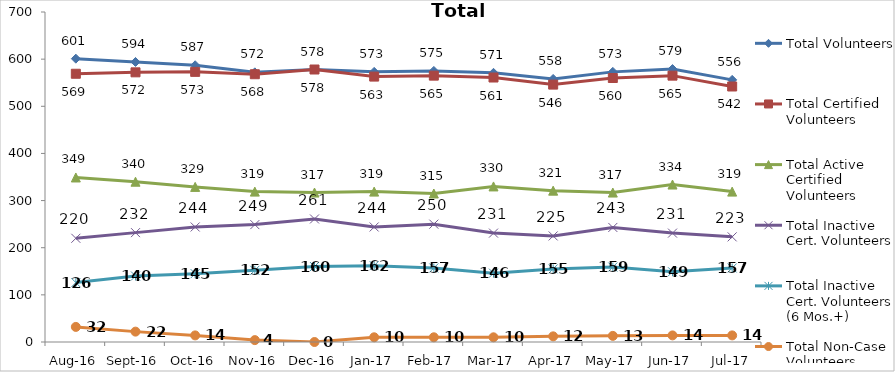
| Category | Total Volunteers | Total Certified Volunteers | Total Active Certified Volunteers | Total Inactive Cert. Volunteers | Total Inactive Cert. Volunteers (6 Mos.+) | Total Non-Case Volunteers |
|---|---|---|---|---|---|---|
| Aug-16 | 601 | 569 | 349 | 220 | 126 | 32 |
| Sep-16 | 594 | 572 | 340 | 232 | 140 | 22 |
| Oct-16 | 587 | 573 | 329 | 244 | 145 | 14 |
| Nov-16 | 572 | 568 | 319 | 249 | 152 | 4 |
| Dec-16 | 578 | 578 | 317 | 261 | 160 | 0 |
| Jan-17 | 573 | 563 | 319 | 244 | 162 | 10 |
| Feb-17 | 575 | 565 | 315 | 250 | 157 | 10 |
| Mar-17 | 571 | 561 | 330 | 231 | 146 | 10 |
| Apr-17 | 558 | 546 | 321 | 225 | 155 | 12 |
| May-17 | 573 | 560 | 317 | 243 | 159 | 13 |
| Jun-17 | 579 | 565 | 334 | 231 | 149 | 14 |
| Jul-17 | 556 | 542 | 319 | 223 | 157 | 14 |